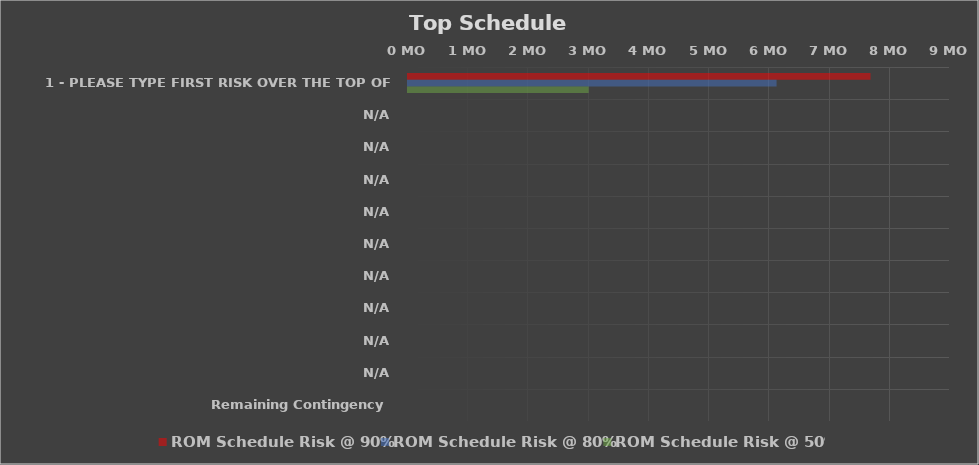
| Category | ROM Schedule Risk @ 90% | ROM Schedule Risk @ 80% | ROM Schedule Risk @ 50% |
|---|---|---|---|
| 1 - PLEASE TYPE FIRST RISK OVER THE TOP OF THIS ONE | 7.68 | 6.12 | 3 |
| N/A | 0 | 0 | 0 |
| N/A | 0 | 0 | 0 |
| N/A | 0 | 0 | 0 |
| N/A | 0 | 0 | 0 |
| N/A | 0 | 0 | 0 |
| N/A | 0 | 0 | 0 |
| N/A | 0 | 0 | 0 |
| N/A | 0 | 0 | 0 |
| N/A | 0 | 0 | 0 |
| Remaining Contingency | 0 | 0 | 0 |